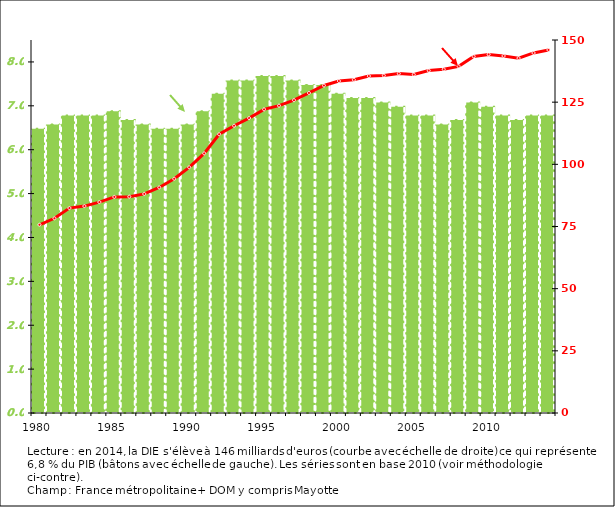
| Category | DIE/PIB |
|---|---|
| 1980 | 6.5 |
| 1981 | 6.6 |
| 1982 | 6.8 |
| 1983 | 6.8 |
| 1984 | 6.8 |
| 1985 | 6.9 |
| 1986 | 6.7 |
| 1987 | 6.6 |
| 1988 | 6.5 |
| 1989 | 6.5 |
| 1990 | 6.6 |
| 1991 | 6.9 |
| 1992 | 7.3 |
| 1993 | 7.6 |
| 1994 | 7.6 |
| 1995 | 7.7 |
| 1996 | 7.7 |
| 1997 | 7.6 |
| 1998 | 7.5 |
| 1999 | 7.5 |
| 2000 | 7.3 |
| 2001 | 7.2 |
| 2002 | 7.2 |
| 2003 | 7.1 |
| 2004 | 7 |
| 2005 | 6.8 |
| 2006 | 6.8 |
| 2007 | 6.6 |
| 2008 | 6.7 |
| 2009 | 7.1 |
| 2010 | 7 |
| 2011 | 6.8 |
| 2012 | 6.7 |
| 2013 | 6.8 |
| 2014p | 6.8 |